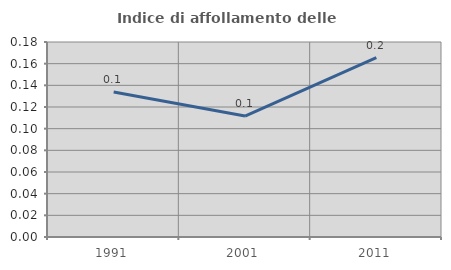
| Category | Indice di affollamento delle abitazioni  |
|---|---|
| 1991.0 | 0.134 |
| 2001.0 | 0.112 |
| 2011.0 | 0.165 |